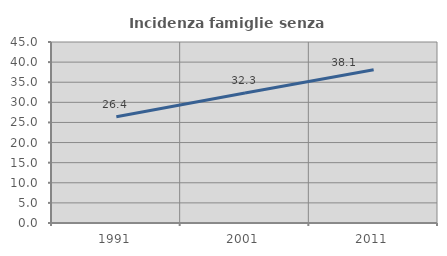
| Category | Incidenza famiglie senza nuclei |
|---|---|
| 1991.0 | 26.415 |
| 2001.0 | 32.312 |
| 2011.0 | 38.119 |